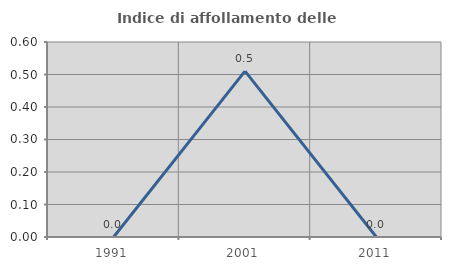
| Category | Indice di affollamento delle abitazioni  |
|---|---|
| 1991.0 | 0 |
| 2001.0 | 0.51 |
| 2011.0 | 0 |